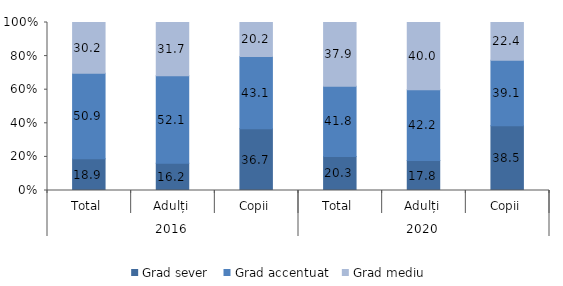
| Category | Grad sever | Grad accentuat | Grad mediu |
|---|---|---|---|
| 0 | 18.9 | 50.9 | 30.2 |
| 1 | 16.2 | 52.1 | 31.743 |
| 2 | 36.7 | 43.1 | 20.2 |
| 3 | 20.3 | 41.8 | 37.9 |
| 4 | 17.8 | 42.2 | 40 |
| 5 | 38.5 | 39.1 | 22.4 |